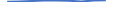
| Category | Series 0 |
|---|---|
| 0 | 1 |
| 1 | 3 |
| 2 | 5 |
| 3 | 8 |
| 4 | 8 |
| 5 | 6 |
| 6 | 3 |
| 7 | 7 |
| 8 | 9 |